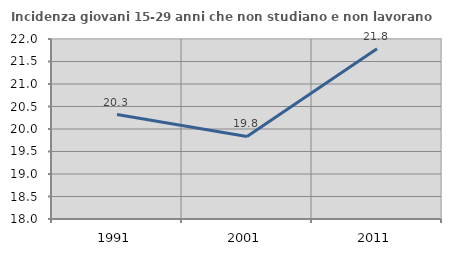
| Category | Incidenza giovani 15-29 anni che non studiano e non lavorano  |
|---|---|
| 1991.0 | 20.321 |
| 2001.0 | 19.835 |
| 2011.0 | 21.782 |